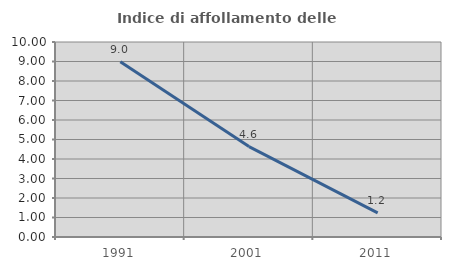
| Category | Indice di affollamento delle abitazioni  |
|---|---|
| 1991.0 | 8.992 |
| 2001.0 | 4.636 |
| 2011.0 | 1.241 |